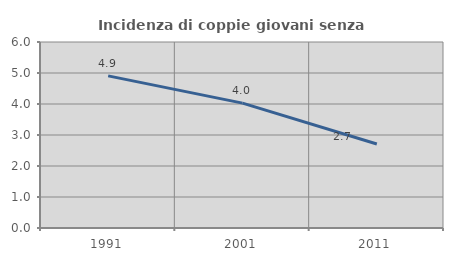
| Category | Incidenza di coppie giovani senza figli |
|---|---|
| 1991.0 | 4.907 |
| 2001.0 | 4.028 |
| 2011.0 | 2.711 |